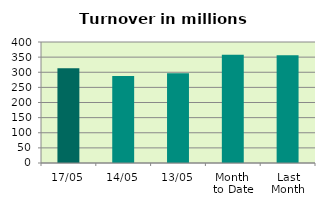
| Category | Series 0 |
|---|---|
| 17/05 | 312.999 |
| 14/05 | 287.486 |
| 13/05 | 296.43 |
| Month 
to Date | 357.763 |
| Last
Month | 356.105 |